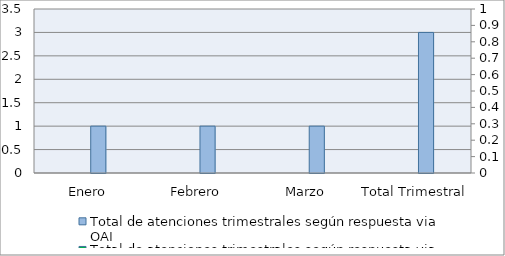
| Category | Total de atenciones trimestrales según respuesta via OAI | Series 2 | Series 4 |
|---|---|---|---|
| Enero | 1 |  |  |
| Febrero | 1 |  |  |
| Marzo | 1 |  |  |
| Total Trimestral | 3 |  |  |